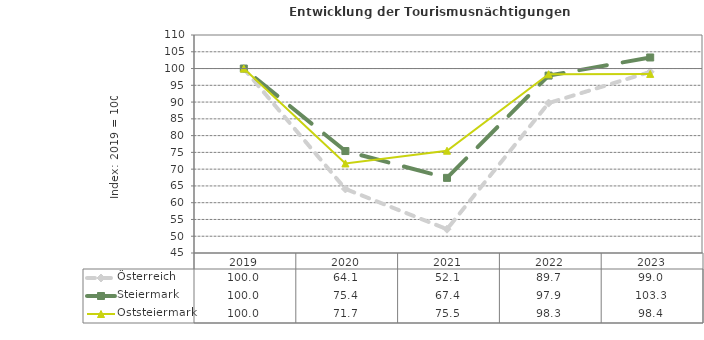
| Category | Österreich | Steiermark | Oststeiermark |
|---|---|---|---|
| 2023.0 | 99 | 103.3 | 98.4 |
| 2022.0 | 89.7 | 97.9 | 98.3 |
| 2021.0 | 52.1 | 67.4 | 75.5 |
| 2020.0 | 64.1 | 75.4 | 71.7 |
| 2019.0 | 100 | 100 | 100 |